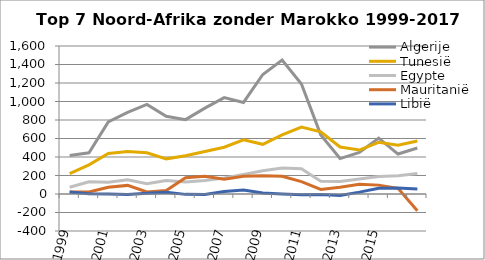
| Category | Algerije | Tunesië | Egypte | Mauritanië | Libië |
|---|---|---|---|---|---|
| 1999.0 | 416 | 220 | 73 | 22 | 21 |
| 2000.0 | 446 | 315 | 132 | 21 | 2 |
| 2001.0 | 779 | 437 | 127 | 72 | -1 |
| 2002.0 | 882 | 459 | 153 | 93 | -6 |
| 2003.0 | 968 | 446 | 111 | 23 | 9 |
| 2004.0 | 841 | 380 | 147 | 37 | 18 |
| 2005.0 | 804 | 413 | 129 | 176 | -4 |
| 2006.0 | 928 | 459 | 145 | 191 | -6 |
| 2007.0 | 1042 | 506 | 174 | 160 | 27 |
| 2008.0 | 990 | 585 | 211 | 192 | 44 |
| 2009.0 | 1292 | 537 | 252 | 197 | 11 |
| 2010.0 | 1449 | 640 | 280 | 192 | 0 |
| 2011.0 | 1189 | 724 | 272 | 134 | -7 |
| 2012.0 | 639 | 672 | 138 | 49 | -5 |
| 2013.0 | 383 | 508 | 134 | 74 | -16 |
| 2014.0 | 449 | 475 | 161 | 106 | 20 |
| 2015.0 | 605 | 559 | 189 | 96 | 63 |
| 2016.0 | 432 | 528 | 197 | 61 | 65 |
| nan | 497 | 573 | 222 | -180 | 53 |